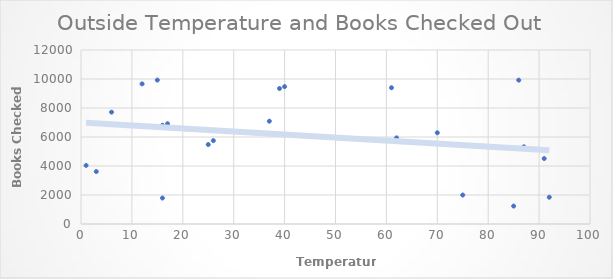
| Category | Series 0 |
|---|---|
| 92.0 | 1847 |
| 86.0 | 9921 |
| 39.0 | 9345 |
| 25.0 | 5481 |
| 3.0 | 3616 |
| 37.0 | 7091 |
| 26.0 | 5749 |
| 6.0 | 7714 |
| 16.0 | 1790 |
| 85.0 | 1236 |
| 17.0 | 6915 |
| 12.0 | 9663 |
| 91.0 | 4514 |
| 40.0 | 9474 |
| 16.0 | 6811 |
| 70.0 | 6292 |
| 75.0 | 1998 |
| 61.0 | 9398 |
| 1.0 | 4039 |
| 15.0 | 9926 |
| 87.0 | 5325 |
| 62.0 | 5941 |